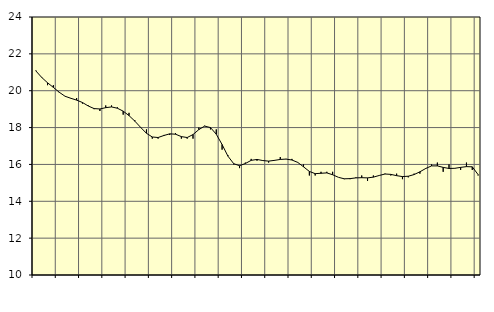
| Category | Piggar | Tillverkning o utvinning, energi o miljö, SNI 05-33, 35-39 |
|---|---|---|
| nan | 21.1 | 21.07 |
| 1.0 | 20.7 | 20.72 |
| 1.0 | 20.3 | 20.43 |
| 1.0 | 20.3 | 20.18 |
| nan | 19.9 | 19.92 |
| 2.0 | 19.7 | 19.7 |
| 2.0 | 19.6 | 19.59 |
| 2.0 | 19.6 | 19.49 |
| nan | 19.3 | 19.36 |
| 3.0 | 19.2 | 19.17 |
| 3.0 | 19 | 19.03 |
| 3.0 | 18.9 | 19.01 |
| nan | 19.2 | 19.08 |
| 4.0 | 19.2 | 19.12 |
| 4.0 | 19.1 | 19.05 |
| 4.0 | 18.7 | 18.89 |
| nan | 18.8 | 18.65 |
| 5.0 | 18.4 | 18.35 |
| 5.0 | 18 | 18.01 |
| 5.0 | 17.9 | 17.69 |
| nan | 17.4 | 17.49 |
| 6.0 | 17.4 | 17.46 |
| 6.0 | 17.6 | 17.57 |
| 6.0 | 17.6 | 17.66 |
| nan | 17.7 | 17.64 |
| 7.0 | 17.4 | 17.51 |
| 7.0 | 17.4 | 17.46 |
| 7.0 | 17.4 | 17.62 |
| nan | 18 | 17.89 |
| 8.0 | 18.1 | 18.08 |
| 8.0 | 17.9 | 18 |
| 8.0 | 17.9 | 17.64 |
| nan | 16.8 | 17.08 |
| 9.0 | 16.5 | 16.45 |
| 9.0 | 16 | 16.04 |
| 9.0 | 15.8 | 15.93 |
| nan | 16.1 | 16.05 |
| 10.0 | 16.3 | 16.22 |
| 10.0 | 16.2 | 16.27 |
| 10.0 | 16.2 | 16.21 |
| nan | 16.1 | 16.18 |
| 11.0 | 16.2 | 16.22 |
| 11.0 | 16.4 | 16.27 |
| 11.0 | 16.3 | 16.29 |
| nan | 16.3 | 16.24 |
| 12.0 | 16.1 | 16.11 |
| 12.0 | 16 | 15.87 |
| 12.0 | 15.4 | 15.62 |
| nan | 15.4 | 15.5 |
| 13.0 | 15.6 | 15.52 |
| 13.0 | 15.6 | 15.54 |
| 13.0 | 15.6 | 15.44 |
| nan | 15.3 | 15.3 |
| 14.0 | 15.2 | 15.22 |
| 14.0 | 15.2 | 15.23 |
| 14.0 | 15.3 | 15.27 |
| nan | 15.4 | 15.28 |
| 15.0 | 15.1 | 15.27 |
| 15.0 | 15.4 | 15.31 |
| 15.0 | 15.4 | 15.4 |
| nan | 15.5 | 15.48 |
| 16.0 | 15.4 | 15.46 |
| 16.0 | 15.5 | 15.39 |
| 16.0 | 15.2 | 15.34 |
| nan | 15.3 | 15.36 |
| 17.0 | 15.5 | 15.45 |
| 17.0 | 15.5 | 15.6 |
| 17.0 | 15.8 | 15.78 |
| nan | 16 | 15.92 |
| 18.0 | 16.1 | 15.92 |
| 18.0 | 15.6 | 15.84 |
| 18.0 | 16 | 15.78 |
| nan | 15.8 | 15.79 |
| 19.0 | 15.7 | 15.84 |
| 19.0 | 16.1 | 15.88 |
| 19.0 | 15.7 | 15.87 |
| nan | 15.4 | 15.45 |